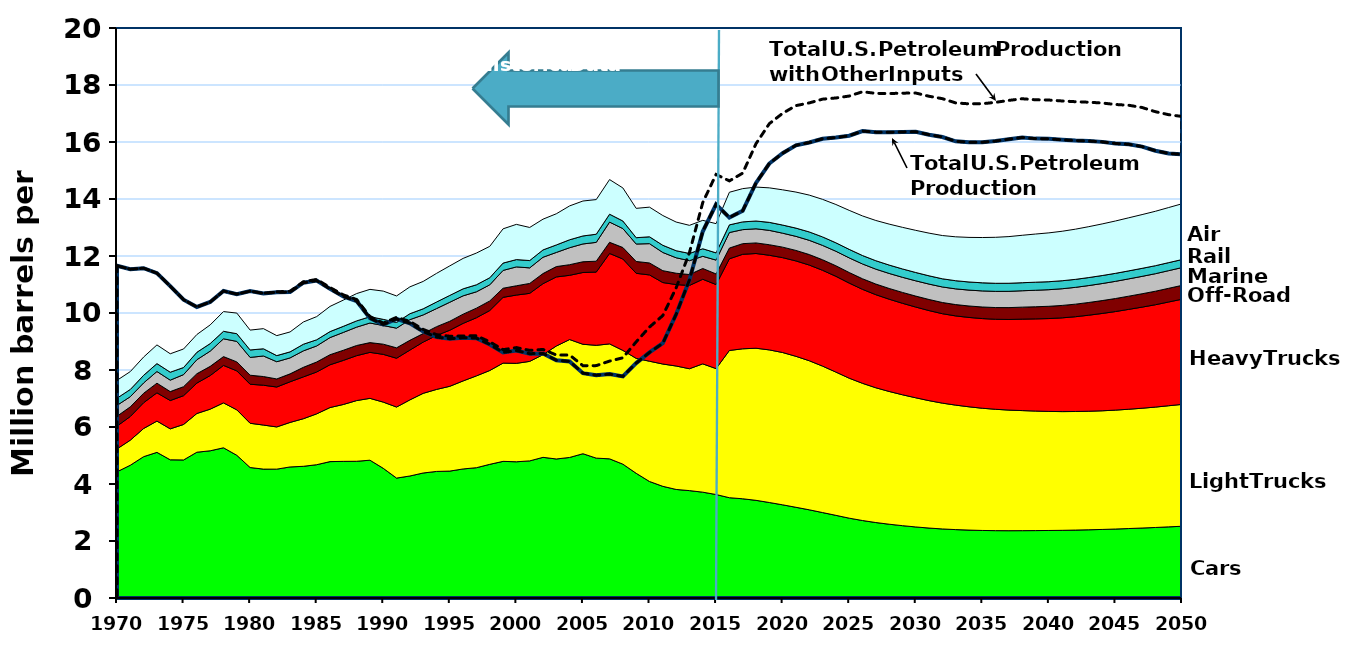
| Category | Autos & MC | Light trucks | Heavy vehicles | Off-highway | Water | Rail | Air |
|---|---|---|---|---|---|---|---|
| 1970.0 | 4.428 | 0.803 | 0.8 | 0.347 | 0.381 | 0.253 | 0.625 |
| 1971.0 | 4.659 | 0.88 | 0.83 | 0.339 | 0.356 | 0.254 | 0.627 |
| 1972.0 | 4.959 | 0.988 | 0.905 | 0.331 | 0.363 | 0.266 | 0.642 |
| 1973.0 | 5.11 | 1.098 | 0.992 | 0.338 | 0.41 | 0.277 | 0.656 |
| 1974.0 | 4.849 | 1.087 | 0.993 | 0.314 | 0.402 | 0.278 | 0.647 |
| 1975.0 | 4.844 | 1.245 | 1.011 | 0.316 | 0.423 | 0.249 | 0.651 |
| 1976.0 | 5.115 | 1.359 | 1.068 | 0.327 | 0.492 | 0.26 | 0.624 |
| 1977.0 | 5.165 | 1.46 | 1.179 | 0.323 | 0.534 | 0.265 | 0.655 |
| 1978.0 | 5.27 | 1.576 | 1.314 | 0.31 | 0.624 | 0.264 | 0.691 |
| 1979.0 | 5.007 | 1.595 | 1.367 | 0.316 | 0.719 | 0.27 | 0.723 |
| 1980.0 | 4.578 | 1.552 | 1.37 | 0.317 | 0.625 | 0.262 | 0.697 |
| 1981.0 | 4.522 | 1.546 | 1.398 | 0.305 | 0.722 | 0.253 | 0.706 |
| 1982.0 | 4.521 | 1.481 | 1.401 | 0.283 | 0.604 | 0.214 | 0.701 |
| 1983.0 | 4.599 | 1.562 | 1.426 | 0.278 | 0.561 | 0.212 | 0.699 |
| 1984.0 | 4.621 | 1.67 | 1.467 | 0.337 | 0.577 | 0.232 | 0.781 |
| 1985.0 | 4.677 | 1.785 | 1.468 | 0.35 | 0.564 | 0.216 | 0.814 |
| 1986.0 | 4.786 | 1.897 | 1.502 | 0.352 | 0.601 | 0.21 | 0.884 |
| 1987.0 | 4.794 | 1.996 | 1.546 | 0.356 | 0.626 | 0.213 | 0.92 |
| 1988.0 | 4.797 | 2.13 | 1.575 | 0.357 | 0.644 | 0.22 | 0.958 |
| 1989.0 | 4.835 | 2.17 | 1.613 | 0.342 | 0.688 | 0.221 | 0.96 |
| 1990.0 | 4.55 | 2.323 | 1.676 | 0.357 | 0.655 | 0.216 | 0.991 |
| 1991.0 | 4.208 | 2.493 | 1.712 | 0.365 | 0.69 | 0.202 | 0.928 |
| 1992.0 | 4.281 | 2.67 | 1.747 | 0.345 | 0.724 | 0.208 | 0.942 |
| 1993.0 | 4.387 | 2.795 | 1.798 | 0.3 | 0.653 | 0.215 | 0.961 |
| 1994.0 | 4.441 | 2.877 | 1.892 | 0.309 | 0.635 | 0.23 | 1.004 |
| 1995.0 | 4.453 | 2.975 | 1.967 | 0.316 | 0.668 | 0.239 | 1.036 |
| 1996.0 | 4.528 | 3.089 | 2.019 | 0.323 | 0.644 | 0.245 | 1.068 |
| 1997.0 | 4.572 | 3.222 | 2.04 | 0.337 | 0.574 | 0.246 | 1.113 |
| 1998.0 | 4.69 | 3.292 | 2.104 | 0.337 | 0.566 | 0.248 | 1.102 |
| 1999.0 | 4.794 | 3.448 | 2.308 | 0.32 | 0.625 | 0.257 | 1.202 |
| 2000.0 | 4.78 | 3.453 | 2.396 | 0.326 | 0.662 | 0.256 | 1.236 |
| 2001.0 | 4.811 | 3.491 | 2.387 | 0.348 | 0.546 | 0.257 | 1.161 |
| 2002.0 | 4.936 | 3.602 | 2.491 | 0.355 | 0.572 | 0.257 | 1.079 |
| 2003.0 | 4.878 | 3.963 | 2.423 | 0.364 | 0.496 | 0.263 | 1.094 |
| 2004.0 | 4.932 | 4.137 | 2.254 | 0.372 | 0.596 | 0.278 | 1.188 |
| 2005.0 | 5.062 | 3.84 | 2.519 | 0.376 | 0.625 | 0.281 | 1.226 |
| 2006.0 | 4.907 | 3.959 | 2.57 | 0.381 | 0.661 | 0.286 | 1.216 |
| 2007.0 | 4.883 | 4.034 | 3.172 | 0.392 | 0.709 | 0.277 | 1.215 |
| 2008.0 | 4.696 | 3.992 | 3.207 | 0.403 | 0.664 | 0.266 | 1.16 |
| 2009.0 | 4.375 | 4.033 | 2.985 | 0.415 | 0.613 | 0.221 | 1.029 |
| 2010.0 | 4.088 | 4.22 | 3.027 | 0.421 | 0.677 | 0.241 | 1.04 |
| 2011.0 | 3.919 | 4.291 | 2.858 | 0.417 | 0.638 | 0.253 | 1.044 |
| 2012.0 | 3.809 | 4.331 | 2.858 | 0.398 | 0.543 | 0.248 | 1.006 |
| 2013.0 | 3.768 | 4.276 | 2.921 | 0.384 | 0.486 | 0.254 | 0.987 |
| 2014.0 | 3.714 | 4.502 | 2.969 | 0.378 | 0.426 | 0.265 | 0.997 |
| 2015.0 | 3.631 | 4.418 | 2.949 | 0.373 | 0.486 | 0.254 | 1.025 |
| 2016.0 | 3.519 | 5.166 | 3.217 | 0.377 | 0.545 | 0.269 | 1.144 |
| 2017.0 | 3.482 | 5.262 | 3.316 | 0.373 | 0.492 | 0.272 | 1.167 |
| 2018.0 | 3.427 | 5.337 | 3.323 | 0.371 | 0.496 | 0.273 | 1.191 |
| 2019.0 | 3.351 | 5.355 | 3.321 | 0.369 | 0.504 | 0.28 | 1.211 |
| 2020.0 | 3.27 | 5.344 | 3.329 | 0.369 | 0.49 | 0.285 | 1.236 |
| 2021.0 | 3.183 | 5.297 | 3.347 | 0.368 | 0.494 | 0.289 | 1.264 |
| 2022.0 | 3.095 | 5.23 | 3.358 | 0.369 | 0.499 | 0.295 | 1.292 |
| 2023.0 | 2.998 | 5.138 | 3.363 | 0.37 | 0.504 | 0.297 | 1.318 |
| 2024.0 | 2.9 | 5.027 | 3.36 | 0.37 | 0.509 | 0.297 | 1.343 |
| 2025.0 | 2.801 | 4.911 | 3.337 | 0.371 | 0.514 | 0.299 | 1.368 |
| 2026.0 | 2.718 | 4.814 | 3.298 | 0.372 | 0.518 | 0.296 | 1.389 |
| 2027.0 | 2.648 | 4.729 | 3.266 | 0.374 | 0.523 | 0.296 | 1.412 |
| 2028.0 | 2.589 | 4.658 | 3.237 | 0.378 | 0.527 | 0.294 | 1.437 |
| 2029.0 | 2.538 | 4.593 | 3.21 | 0.381 | 0.531 | 0.293 | 1.46 |
| 2030.0 | 2.493 | 4.532 | 3.184 | 0.385 | 0.535 | 0.292 | 1.479 |
| 2031.0 | 2.454 | 4.471 | 3.16 | 0.389 | 0.541 | 0.29 | 1.497 |
| 2032.0 | 2.423 | 4.415 | 3.137 | 0.393 | 0.546 | 0.287 | 1.517 |
| 2033.0 | 2.4 | 4.368 | 3.13 | 0.397 | 0.552 | 0.286 | 1.54 |
| 2034.0 | 2.383 | 4.326 | 3.135 | 0.402 | 0.558 | 0.285 | 1.564 |
| 2035.0 | 2.37 | 4.288 | 3.147 | 0.406 | 0.564 | 0.284 | 1.589 |
| 2036.0 | 2.364 | 4.258 | 3.159 | 0.411 | 0.568 | 0.283 | 1.613 |
| 2037.0 | 2.362 | 4.232 | 3.18 | 0.416 | 0.572 | 0.283 | 1.638 |
| 2038.0 | 2.363 | 4.213 | 3.21 | 0.42 | 0.575 | 0.282 | 1.665 |
| 2039.0 | 2.365 | 4.194 | 3.234 | 0.425 | 0.579 | 0.283 | 1.69 |
| 2040.0 | 2.369 | 4.178 | 3.258 | 0.43 | 0.582 | 0.281 | 1.713 |
| 2041.0 | 2.375 | 4.166 | 3.29 | 0.436 | 0.586 | 0.28 | 1.736 |
| 2042.0 | 2.383 | 4.161 | 3.326 | 0.441 | 0.59 | 0.28 | 1.761 |
| 2043.0 | 2.394 | 4.16 | 3.37 | 0.446 | 0.594 | 0.281 | 1.786 |
| 2044.0 | 2.406 | 4.163 | 3.415 | 0.452 | 0.598 | 0.281 | 1.811 |
| 2045.0 | 2.42 | 4.172 | 3.458 | 0.457 | 0.603 | 0.281 | 1.837 |
| 2046.0 | 2.437 | 4.186 | 3.505 | 0.463 | 0.607 | 0.281 | 1.862 |
| 2047.0 | 2.456 | 4.203 | 3.548 | 0.469 | 0.611 | 0.281 | 1.886 |
| 2048.0 | 2.474 | 4.224 | 3.591 | 0.474 | 0.615 | 0.281 | 1.909 |
| 2049.0 | 2.496 | 4.25 | 3.641 | 0.48 | 0.619 | 0.281 | 1.933 |
| 2050.0 | 2.517 | 4.276 | 3.691 | 0.486 | 0.624 | 0.282 | 1.957 |